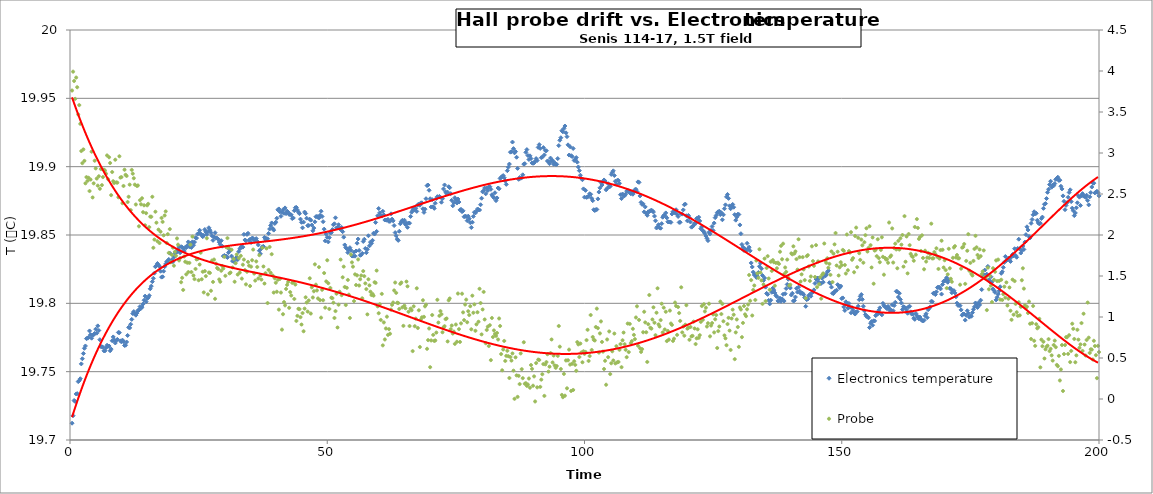
| Category | Electronics temperature |
|---|---|
| 0.4 | 19.712 |
| 0.6000000000000001 | 19.718 |
| 0.8 | 19.729 |
| 1.0 | 19.728 |
| 1.2 | 19.734 |
| 1.4 | 19.734 |
| 1.5999999999999999 | 19.743 |
| 1.7999999999999998 | 19.743 |
| 1.9999999999999998 | 19.745 |
| 2.1999999999999997 | 19.756 |
| 2.4 | 19.759 |
| 2.6 | 19.763 |
| 2.8000000000000003 | 19.767 |
| 3.0000000000000004 | 19.769 |
| 3.2000000000000006 | 19.774 |
| 3.400000000000001 | 19.774 |
| 3.600000000000001 | 19.775 |
| 3.800000000000001 | 19.78 |
| 4.000000000000001 | 19.777 |
| 4.200000000000001 | 19.774 |
| 4.400000000000001 | 19.777 |
| 4.600000000000001 | 19.777 |
| 4.800000000000002 | 19.778 |
| 5.000000000000002 | 19.781 |
| 5.200000000000002 | 19.778 |
| 5.400000000000002 | 19.784 |
| 5.600000000000002 | 19.78 |
| 5.8000000000000025 | 19.773 |
| 6.000000000000003 | 19.768 |
| 6.200000000000003 | 19.768 |
| 6.400000000000003 | 19.768 |
| 6.600000000000003 | 19.765 |
| 6.800000000000003 | 19.765 |
| 7.0000000000000036 | 19.767 |
| 7.200000000000004 | 19.769 |
| 7.400000000000004 | 19.769 |
| 7.600000000000004 | 19.769 |
| 7.800000000000004 | 19.765 |
| 8.000000000000004 | 19.767 |
| 8.200000000000003 | 19.773 |
| 8.400000000000002 | 19.775 |
| 8.600000000000001 | 19.773 |
| 8.8 | 19.771 |
| 9.0 | 19.773 |
| 9.2 | 19.774 |
| 9.399999999999999 | 19.779 |
| 9.599999999999998 | 19.779 |
| 9.799999999999997 | 19.773 |
| 9.999999999999996 | 19.772 |
| 10.199999999999996 | 19.773 |
| 10.399999999999995 | 19.772 |
| 10.599999999999994 | 19.769 |
| 10.799999999999994 | 19.769 |
| 10.999999999999993 | 19.772 |
| 11.199999999999992 | 19.776 |
| 11.399999999999991 | 19.782 |
| 11.59999999999999 | 19.782 |
| 11.79999999999999 | 19.785 |
| 11.99999999999999 | 19.788 |
| 12.199999999999989 | 19.793 |
| 12.399999999999988 | 19.794 |
| 12.599999999999987 | 19.792 |
| 12.799999999999986 | 19.791 |
| 12.999999999999986 | 19.793 |
| 13.199999999999985 | 19.795 |
| 13.399999999999984 | 19.795 |
| 13.599999999999984 | 19.798 |
| 13.799999999999983 | 19.796 |
| 13.999999999999982 | 19.797 |
| 14.199999999999982 | 19.799 |
| 14.39999999999998 | 19.802 |
| 14.59999999999998 | 19.805 |
| 14.79999999999998 | 19.801 |
| 14.999999999999979 | 19.804 |
| 15.199999999999978 | 19.804 |
| 15.399999999999977 | 19.806 |
| 15.599999999999977 | 19.811 |
| 15.799999999999976 | 19.813 |
| 15.999999999999975 | 19.816 |
| 16.199999999999974 | 19.818 |
| 16.399999999999974 | 19.822 |
| 16.599999999999973 | 19.827 |
| 16.799999999999972 | 19.828 |
| 16.99999999999997 | 19.829 |
| 17.19999999999997 | 19.828 |
| 17.39999999999997 | 19.827 |
| 17.59999999999997 | 19.823 |
| 17.79999999999997 | 19.819 |
| 17.999999999999968 | 19.819 |
| 18.199999999999967 | 19.824 |
| 18.399999999999967 | 19.827 |
| 18.599999999999966 | 19.829 |
| 18.799999999999965 | 19.83 |
| 18.999999999999964 | 19.831 |
| 19.199999999999964 | 19.832 |
| 19.399999999999963 | 19.837 |
| 19.599999999999962 | 19.831 |
| 19.79999999999996 | 19.832 |
| 19.99999999999996 | 19.83 |
| 20.19999999999996 | 19.834 |
| 20.39999999999996 | 19.837 |
| 20.59999999999996 | 19.838 |
| 20.799999999999958 | 19.838 |
| 20.999999999999957 | 19.839 |
| 21.199999999999957 | 19.841 |
| 21.399999999999956 | 19.837 |
| 21.599999999999955 | 19.841 |
| 21.799999999999955 | 19.841 |
| 21.999999999999954 | 19.84 |
| 22.199999999999953 | 19.838 |
| 22.399999999999952 | 19.841 |
| 22.59999999999995 | 19.841 |
| 22.79999999999995 | 19.842 |
| 22.99999999999995 | 19.845 |
| 23.19999999999995 | 19.841 |
| 23.39999999999995 | 19.844 |
| 23.599999999999948 | 19.841 |
| 23.799999999999947 | 19.845 |
| 23.999999999999947 | 19.843 |
| 24.199999999999946 | 19.845 |
| 24.399999999999945 | 19.848 |
| 24.599999999999945 | 19.848 |
| 24.799999999999944 | 19.851 |
| 24.999999999999943 | 19.851 |
| 25.199999999999942 | 19.853 |
| 25.39999999999994 | 19.851 |
| 25.59999999999994 | 19.85 |
| 25.79999999999994 | 19.849 |
| 25.99999999999994 | 19.85 |
| 26.19999999999994 | 19.854 |
| 26.399999999999938 | 19.852 |
| 26.599999999999937 | 19.85 |
| 26.799999999999937 | 19.852 |
| 26.999999999999936 | 19.855 |
| 27.199999999999935 | 19.854 |
| 27.399999999999935 | 19.852 |
| 27.599999999999934 | 19.849 |
| 27.799999999999933 | 19.846 |
| 27.999999999999932 | 19.849 |
| 28.199999999999932 | 19.852 |
| 28.39999999999993 | 19.848 |
| 28.59999999999993 | 19.848 |
| 28.79999999999993 | 19.847 |
| 28.99999999999993 | 19.845 |
| 29.19999999999993 | 19.843 |
| 29.399999999999928 | 19.846 |
| 29.599999999999927 | 19.842 |
| 29.799999999999926 | 19.835 |
| 29.999999999999925 | 19.835 |
| 30.199999999999925 | 19.835 |
| 30.399999999999924 | 19.835 |
| 30.599999999999923 | 19.834 |
| 30.799999999999923 | 19.837 |
| 30.999999999999922 | 19.839 |
| 31.19999999999992 | 19.839 |
| 31.39999999999992 | 19.835 |
| 31.59999999999992 | 19.831 |
| 31.79999999999992 | 19.833 |
| 31.99999999999992 | 19.83 |
| 32.19999999999992 | 19.832 |
| 32.39999999999992 | 19.834 |
| 32.59999999999992 | 19.832 |
| 32.799999999999926 | 19.838 |
| 32.99999999999993 | 19.84 |
| 33.19999999999993 | 19.841 |
| 33.399999999999935 | 19.841 |
| 33.59999999999994 | 19.841 |
| 33.79999999999994 | 19.85 |
| 33.99999999999994 | 19.846 |
| 34.199999999999946 | 19.846 |
| 34.39999999999995 | 19.85 |
| 34.59999999999995 | 19.851 |
| 34.799999999999955 | 19.846 |
| 34.99999999999996 | 19.847 |
| 35.19999999999996 | 19.844 |
| 35.39999999999996 | 19.848 |
| 35.599999999999966 | 19.847 |
| 35.79999999999997 | 19.846 |
| 35.99999999999997 | 19.847 |
| 36.199999999999974 | 19.847 |
| 36.39999999999998 | 19.845 |
| 36.59999999999998 | 19.843 |
| 36.79999999999998 | 19.838 |
| 36.999999999999986 | 19.836 |
| 37.19999999999999 | 19.84 |
| 37.39999999999999 | 19.841 |
| 37.599999999999994 | 19.842 |
| 37.8 | 19.848 |
| 38.0 | 19.846 |
| 38.2 | 19.847 |
| 38.400000000000006 | 19.847 |
| 38.60000000000001 | 19.851 |
| 38.80000000000001 | 19.854 |
| 39.000000000000014 | 19.857 |
| 39.20000000000002 | 19.859 |
| 39.40000000000002 | 19.855 |
| 39.60000000000002 | 19.854 |
| 39.800000000000026 | 19.858 |
| 40.00000000000003 | 19.859 |
| 40.20000000000003 | 19.862 |
| 40.400000000000034 | 19.868 |
| 40.60000000000004 | 19.869 |
| 40.80000000000004 | 19.867 |
| 41.00000000000004 | 19.864 |
| 41.200000000000045 | 19.867 |
| 41.40000000000005 | 19.868 |
| 41.60000000000005 | 19.866 |
| 41.800000000000054 | 19.87 |
| 42.00000000000006 | 19.866 |
| 42.20000000000006 | 19.867 |
| 42.40000000000006 | 19.867 |
| 42.600000000000065 | 19.865 |
| 42.80000000000007 | 19.865 |
| 43.00000000000007 | 19.865 |
| 43.200000000000074 | 19.862 |
| 43.40000000000008 | 19.862 |
| 43.60000000000008 | 19.868 |
| 43.80000000000008 | 19.87 |
| 44.000000000000085 | 19.87 |
| 44.20000000000009 | 19.868 |
| 44.40000000000009 | 19.867 |
| 44.600000000000094 | 19.866 |
| 44.8000000000001 | 19.862 |
| 45.0000000000001 | 19.859 |
| 45.2000000000001 | 19.855 |
| 45.400000000000105 | 19.859 |
| 45.60000000000011 | 19.867 |
| 45.80000000000011 | 19.866 |
| 46.000000000000114 | 19.862 |
| 46.20000000000012 | 19.857 |
| 46.40000000000012 | 19.857 |
| 46.60000000000012 | 19.862 |
| 46.800000000000125 | 19.861 |
| 47.00000000000013 | 19.857 |
| 47.20000000000013 | 19.853 |
| 47.400000000000134 | 19.855 |
| 47.600000000000136 | 19.86 |
| 47.80000000000014 | 19.863 |
| 48.00000000000014 | 19.864 |
| 48.200000000000145 | 19.863 |
| 48.40000000000015 | 19.863 |
| 48.60000000000015 | 19.864 |
| 48.80000000000015 | 19.867 |
| 49.000000000000156 | 19.864 |
| 49.20000000000016 | 19.86 |
| 49.40000000000016 | 19.854 |
| 49.600000000000165 | 19.846 |
| 49.80000000000017 | 19.851 |
| 50.00000000000017 | 19.848 |
| 50.20000000000017 | 19.845 |
| 50.400000000000176 | 19.848 |
| 50.60000000000018 | 19.852 |
| 50.80000000000018 | 19.852 |
| 51.000000000000185 | 19.854 |
| 51.20000000000019 | 19.857 |
| 51.40000000000019 | 19.858 |
| 51.60000000000019 | 19.863 |
| 51.800000000000196 | 19.855 |
| 52.0000000000002 | 19.855 |
| 52.2000000000002 | 19.858 |
| 52.400000000000205 | 19.855 |
| 52.60000000000021 | 19.854 |
| 52.80000000000021 | 19.856 |
| 53.00000000000021 | 19.852 |
| 53.200000000000216 | 19.848 |
| 53.40000000000022 | 19.843 |
| 53.60000000000022 | 19.841 |
| 53.800000000000225 | 19.84 |
| 54.00000000000023 | 19.837 |
| 54.20000000000023 | 19.839 |
| 54.40000000000023 | 19.841 |
| 54.600000000000236 | 19.839 |
| 54.80000000000024 | 19.835 |
| 55.00000000000024 | 19.835 |
| 55.200000000000244 | 19.837 |
| 55.40000000000025 | 19.835 |
| 55.60000000000025 | 19.838 |
| 55.80000000000025 | 19.844 |
| 56.000000000000256 | 19.847 |
| 56.20000000000026 | 19.839 |
| 56.40000000000026 | 19.835 |
| 56.600000000000264 | 19.835 |
| 56.80000000000027 | 19.837 |
| 57.00000000000027 | 19.845 |
| 57.20000000000027 | 19.847 |
| 57.400000000000276 | 19.84 |
| 57.60000000000028 | 19.837 |
| 57.80000000000028 | 19.84 |
| 58.000000000000284 | 19.849 |
| 58.20000000000029 | 19.842 |
| 58.40000000000029 | 19.845 |
| 58.60000000000029 | 19.844 |
| 58.800000000000296 | 19.846 |
| 59.0000000000003 | 19.851 |
| 59.2000000000003 | 19.851 |
| 59.400000000000304 | 19.859 |
| 59.60000000000031 | 19.853 |
| 59.80000000000031 | 19.864 |
| 60.00000000000031 | 19.869 |
| 60.200000000000315 | 19.866 |
| 60.40000000000032 | 19.864 |
| 60.60000000000032 | 19.864 |
| 60.800000000000324 | 19.867 |
| 61.00000000000033 | 19.865 |
| 61.20000000000033 | 19.861 |
| 61.40000000000033 | 19.861 |
| 61.600000000000335 | 19.861 |
| 61.80000000000034 | 19.861 |
| 62.00000000000034 | 19.86 |
| 62.200000000000344 | 19.86 |
| 62.40000000000035 | 19.865 |
| 62.60000000000035 | 19.862 |
| 62.80000000000035 | 19.86 |
| 63.000000000000355 | 19.857 |
| 63.20000000000036 | 19.852 |
| 63.40000000000036 | 19.849 |
| 63.600000000000364 | 19.847 |
| 63.80000000000037 | 19.846 |
| 64.00000000000037 | 19.853 |
| 64.20000000000037 | 19.858 |
| 64.40000000000038 | 19.86 |
| 64.60000000000038 | 19.861 |
| 64.80000000000038 | 19.86 |
| 65.00000000000038 | 19.861 |
| 65.20000000000039 | 19.858 |
| 65.40000000000039 | 19.859 |
| 65.60000000000039 | 19.856 |
| 65.8000000000004 | 19.859 |
| 66.0000000000004 | 19.859 |
| 66.2000000000004 | 19.864 |
| 66.4000000000004 | 19.867 |
| 66.6000000000004 | 19.868 |
| 66.80000000000041 | 19.869 |
| 67.00000000000041 | 19.868 |
| 67.20000000000041 | 19.87 |
| 67.40000000000042 | 19.867 |
| 67.60000000000042 | 19.872 |
| 67.80000000000042 | 19.872 |
| 68.00000000000043 | 19.872 |
| 68.20000000000043 | 19.873 |
| 68.40000000000043 | 19.874 |
| 68.60000000000043 | 19.869 |
| 68.80000000000044 | 19.867 |
| 69.00000000000044 | 19.869 |
| 69.20000000000044 | 19.877 |
| 69.40000000000045 | 19.886 |
| 69.60000000000045 | 19.887 |
| 69.80000000000045 | 19.883 |
| 70.00000000000045 | 19.877 |
| 70.20000000000046 | 19.871 |
| 70.40000000000046 | 19.876 |
| 70.60000000000046 | 19.871 |
| 70.80000000000047 | 19.869 |
| 71.00000000000047 | 19.873 |
| 71.20000000000047 | 19.877 |
| 71.40000000000047 | 19.878 |
| 71.60000000000048 | 19.878 |
| 71.80000000000048 | 19.878 |
| 72.00000000000048 | 19.878 |
| 72.20000000000049 | 19.874 |
| 72.40000000000049 | 19.877 |
| 72.60000000000049 | 19.884 |
| 72.8000000000005 | 19.887 |
| 73.0000000000005 | 19.882 |
| 73.2000000000005 | 19.88 |
| 73.4000000000005 | 19.881 |
| 73.6000000000005 | 19.885 |
| 73.80000000000051 | 19.885 |
| 74.00000000000051 | 19.88 |
| 74.20000000000051 | 19.875 |
| 74.40000000000052 | 19.871 |
| 74.60000000000052 | 19.874 |
| 74.80000000000052 | 19.877 |
| 75.00000000000053 | 19.876 |
| 75.20000000000053 | 19.873 |
| 75.40000000000053 | 19.876 |
| 75.60000000000053 | 19.874 |
| 75.80000000000054 | 19.868 |
| 76.00000000000054 | 19.869 |
| 76.20000000000054 | 19.867 |
| 76.40000000000055 | 19.868 |
| 76.60000000000055 | 19.863 |
| 76.80000000000055 | 19.864 |
| 77.00000000000055 | 19.863 |
| 77.20000000000056 | 19.86 |
| 77.40000000000056 | 19.864 |
| 77.60000000000056 | 19.862 |
| 77.80000000000057 | 19.859 |
| 78.00000000000057 | 19.855 |
| 78.20000000000057 | 19.859 |
| 78.40000000000057 | 19.864 |
| 78.60000000000058 | 19.867 |
| 78.80000000000058 | 19.866 |
| 79.00000000000058 | 19.867 |
| 79.20000000000059 | 19.869 |
| 79.40000000000059 | 19.869 |
| 79.60000000000059 | 19.868 |
| 79.8000000000006 | 19.872 |
| 80.0000000000006 | 19.877 |
| 80.2000000000006 | 19.882 |
| 80.4000000000006 | 19.882 |
| 80.6000000000006 | 19.884 |
| 80.80000000000061 | 19.88 |
| 81.00000000000061 | 19.884 |
| 81.20000000000061 | 19.882 |
| 81.40000000000062 | 19.885 |
| 81.60000000000062 | 19.885 |
| 81.80000000000062 | 19.883 |
| 82.00000000000063 | 19.879 |
| 82.20000000000063 | 19.878 |
| 82.40000000000063 | 19.877 |
| 82.60000000000063 | 19.881 |
| 82.80000000000064 | 19.875 |
| 83.00000000000064 | 19.877 |
| 83.20000000000064 | 19.884 |
| 83.40000000000065 | 19.884 |
| 83.60000000000065 | 19.891 |
| 83.80000000000065 | 19.892 |
| 84.00000000000065 | 19.893 |
| 84.20000000000066 | 19.893 |
| 84.40000000000066 | 19.892 |
| 84.60000000000066 | 19.89 |
| 84.80000000000067 | 19.887 |
| 85.00000000000067 | 19.897 |
| 85.20000000000067 | 19.9 |
| 85.40000000000067 | 19.902 |
| 85.60000000000068 | 19.911 |
| 85.80000000000068 | 19.911 |
| 86.00000000000068 | 19.918 |
| 86.20000000000068 | 19.913 |
| 86.40000000000069 | 19.91 |
| 86.60000000000069 | 19.911 |
| 86.8000000000007 | 19.907 |
| 87.0000000000007 | 19.899 |
| 87.2000000000007 | 19.891 |
| 87.4000000000007 | 19.892 |
| 87.6000000000007 | 19.891 |
| 87.80000000000071 | 19.892 |
| 88.00000000000071 | 19.894 |
| 88.20000000000071 | 19.902 |
| 88.40000000000072 | 19.902 |
| 88.60000000000072 | 19.91 |
| 88.80000000000072 | 19.912 |
| 89.00000000000072 | 19.908 |
| 89.20000000000073 | 19.905 |
| 89.40000000000073 | 19.908 |
| 89.60000000000073 | 19.906 |
| 89.80000000000074 | 19.903 |
| 90.00000000000074 | 19.902 |
| 90.20000000000074 | 19.903 |
| 90.40000000000074 | 19.904 |
| 90.60000000000075 | 19.906 |
| 90.80000000000075 | 19.905 |
| 91.00000000000075 | 19.914 |
| 91.20000000000076 | 19.916 |
| 91.40000000000076 | 19.913 |
| 91.60000000000076 | 19.907 |
| 91.80000000000076 | 19.907 |
| 92.00000000000077 | 19.914 |
| 92.20000000000077 | 19.909 |
| 92.40000000000077 | 19.912 |
| 92.60000000000078 | 19.912 |
| 92.80000000000078 | 19.904 |
| 93.00000000000078 | 19.904 |
| 93.20000000000078 | 19.902 |
| 93.40000000000079 | 19.906 |
| 93.60000000000079 | 19.904 |
| 93.8000000000008 | 19.905 |
| 94.0000000000008 | 19.902 |
| 94.2000000000008 | 19.903 |
| 94.4000000000008 | 19.902 |
| 94.6000000000008 | 19.902 |
| 94.80000000000081 | 19.906 |
| 95.00000000000081 | 19.915 |
| 95.20000000000081 | 19.919 |
| 95.40000000000082 | 19.921 |
| 95.60000000000082 | 19.926 |
| 95.80000000000082 | 19.926 |
| 96.00000000000082 | 19.928 |
| 96.20000000000083 | 19.93 |
| 96.40000000000083 | 19.925 |
| 96.60000000000083 | 19.922 |
| 96.80000000000084 | 19.916 |
| 97.00000000000084 | 19.908 |
| 97.20000000000084 | 19.915 |
| 97.40000000000084 | 19.908 |
| 97.60000000000085 | 19.907 |
| 97.80000000000085 | 19.913 |
| 98.00000000000085 | 19.905 |
| 98.20000000000086 | 19.905 |
| 98.40000000000086 | 19.907 |
| 98.60000000000086 | 19.903 |
| 98.80000000000086 | 19.9 |
| 99.00000000000087 | 19.897 |
| 99.20000000000087 | 19.894 |
| 99.40000000000087 | 19.891 |
| 99.60000000000088 | 19.89 |
| 99.80000000000088 | 19.884 |
| 100.00000000000088 | 19.878 |
| 100.20000000000088 | 19.883 |
| 100.40000000000089 | 19.878 |
| 100.60000000000089 | 19.878 |
| 100.80000000000089 | 19.879 |
| 101.0000000000009 | 19.88 |
| 101.2000000000009 | 19.88 |
| 101.4000000000009 | 19.877 |
| 101.6000000000009 | 19.875 |
| 101.8000000000009 | 19.868 |
| 102.00000000000091 | 19.868 |
| 102.20000000000091 | 19.869 |
| 102.40000000000092 | 19.869 |
| 102.60000000000092 | 19.876 |
| 102.80000000000092 | 19.881 |
| 103.00000000000092 | 19.885 |
| 103.20000000000093 | 19.888 |
| 103.40000000000093 | 19.887 |
| 103.60000000000093 | 19.889 |
| 103.80000000000094 | 19.89 |
| 104.00000000000094 | 19.889 |
| 104.20000000000094 | 19.883 |
| 104.40000000000094 | 19.884 |
| 104.60000000000095 | 19.888 |
| 104.80000000000095 | 19.885 |
| 105.00000000000095 | 19.886 |
| 105.20000000000095 | 19.894 |
| 105.40000000000096 | 19.896 |
| 105.60000000000096 | 19.897 |
| 105.80000000000096 | 19.894 |
| 106.00000000000097 | 19.889 |
| 106.20000000000097 | 19.887 |
| 106.40000000000097 | 19.89 |
| 106.60000000000097 | 19.89 |
| 106.80000000000098 | 19.888 |
| 107.00000000000098 | 19.879 |
| 107.20000000000098 | 19.877 |
| 107.40000000000099 | 19.88 |
| 107.60000000000099 | 19.879 |
| 107.80000000000099 | 19.879 |
| 108.000000000001 | 19.88 |
| 108.200000000001 | 19.882 |
| 108.400000000001 | 19.883 |
| 108.600000000001 | 19.882 |
| 108.800000000001 | 19.881 |
| 109.00000000000101 | 19.88 |
| 109.20000000000101 | 19.881 |
| 109.40000000000101 | 19.88 |
| 109.60000000000102 | 19.881 |
| 109.80000000000102 | 19.883 |
| 110.00000000000102 | 19.883 |
| 110.20000000000103 | 19.882 |
| 110.40000000000103 | 19.889 |
| 110.60000000000103 | 19.889 |
| 110.80000000000103 | 19.879 |
| 111.00000000000104 | 19.874 |
| 111.20000000000104 | 19.872 |
| 111.40000000000104 | 19.873 |
| 111.60000000000105 | 19.867 |
| 111.80000000000105 | 19.871 |
| 112.00000000000105 | 19.866 |
| 112.20000000000105 | 19.864 |
| 112.40000000000106 | 19.867 |
| 112.60000000000106 | 19.867 |
| 112.80000000000106 | 19.868 |
| 113.00000000000107 | 19.868 |
| 113.20000000000107 | 19.868 |
| 113.40000000000107 | 19.867 |
| 113.60000000000107 | 19.864 |
| 113.80000000000108 | 19.86 |
| 114.00000000000108 | 19.855 |
| 114.20000000000108 | 19.856 |
| 114.40000000000109 | 19.858 |
| 114.60000000000109 | 19.855 |
| 114.80000000000109 | 19.855 |
| 115.0000000000011 | 19.858 |
| 115.2000000000011 | 19.863 |
| 115.4000000000011 | 19.864 |
| 115.6000000000011 | 19.864 |
| 115.8000000000011 | 19.866 |
| 116.00000000000111 | 19.863 |
| 116.20000000000111 | 19.86 |
| 116.40000000000111 | 19.86 |
| 116.60000000000112 | 19.859 |
| 116.80000000000112 | 19.859 |
| 117.00000000000112 | 19.865 |
| 117.20000000000113 | 19.867 |
| 117.40000000000113 | 19.867 |
| 117.60000000000113 | 19.866 |
| 117.80000000000113 | 19.868 |
| 118.00000000000114 | 19.865 |
| 118.20000000000114 | 19.864 |
| 118.40000000000114 | 19.859 |
| 118.60000000000115 | 19.859 |
| 118.80000000000115 | 19.865 |
| 119.00000000000115 | 19.865 |
| 119.20000000000115 | 19.868 |
| 119.40000000000116 | 19.872 |
| 119.60000000000116 | 19.873 |
| 119.80000000000116 | 19.864 |
| 120.00000000000117 | 19.86 |
| 120.20000000000117 | 19.864 |
| 120.40000000000117 | 19.863 |
| 120.60000000000117 | 19.86 |
| 120.80000000000118 | 19.856 |
| 121.00000000000118 | 19.856 |
| 121.20000000000118 | 19.857 |
| 121.40000000000119 | 19.859 |
| 121.60000000000119 | 19.859 |
| 121.80000000000119 | 19.862 |
| 122.0000000000012 | 19.862 |
| 122.2000000000012 | 19.863 |
| 122.4000000000012 | 19.86 |
| 122.6000000000012 | 19.855 |
| 122.8000000000012 | 19.856 |
| 123.00000000000121 | 19.853 |
| 123.20000000000121 | 19.852 |
| 123.40000000000121 | 19.851 |
| 123.60000000000122 | 19.849 |
| 123.80000000000122 | 19.848 |
| 124.00000000000122 | 19.846 |
| 124.20000000000122 | 19.852 |
| 124.40000000000123 | 19.851 |
| 124.60000000000123 | 19.853 |
| 124.80000000000123 | 19.856 |
| 125.00000000000124 | 19.853 |
| 125.20000000000124 | 19.859 |
| 125.40000000000124 | 19.863 |
| 125.60000000000124 | 19.864 |
| 125.80000000000125 | 19.866 |
| 126.00000000000125 | 19.867 |
| 126.20000000000125 | 19.867 |
| 126.40000000000126 | 19.865 |
| 126.60000000000126 | 19.866 |
| 126.80000000000126 | 19.861 |
| 127.00000000000126 | 19.865 |
| 127.20000000000127 | 19.869 |
| 127.40000000000127 | 19.872 |
| 127.60000000000127 | 19.878 |
| 127.80000000000128 | 19.88 |
| 128.00000000000128 | 19.877 |
| 128.20000000000127 | 19.871 |
| 128.40000000000126 | 19.869 |
| 128.60000000000124 | 19.871 |
| 128.80000000000123 | 19.872 |
| 129.00000000000122 | 19.87 |
| 129.2000000000012 | 19.865 |
| 129.4000000000012 | 19.861 |
| 129.6000000000012 | 19.863 |
| 129.80000000000118 | 19.865 |
| 130.00000000000117 | 19.865 |
| 130.20000000000115 | 19.857 |
| 130.40000000000114 | 19.851 |
| 130.60000000000113 | 19.843 |
| 130.80000000000112 | 19.841 |
| 131.0000000000011 | 19.839 |
| 131.2000000000011 | 19.84 |
| 131.40000000000109 | 19.838 |
| 131.60000000000107 | 19.844 |
| 131.80000000000106 | 19.84 |
| 132.00000000000105 | 19.841 |
| 132.20000000000104 | 19.838 |
| 132.40000000000103 | 19.83 |
| 132.60000000000102 | 19.827 |
| 132.800000000001 | 19.823 |
| 133.000000000001 | 19.821 |
| 133.20000000000098 | 19.821 |
| 133.40000000000097 | 19.819 |
| 133.60000000000096 | 19.82 |
| 133.80000000000095 | 19.823 |
| 134.00000000000094 | 19.827 |
| 134.20000000000093 | 19.829 |
| 134.40000000000092 | 19.825 |
| 134.6000000000009 | 19.82 |
| 134.8000000000009 | 19.817 |
| 135.00000000000088 | 19.819 |
| 135.20000000000087 | 19.812 |
| 135.40000000000086 | 19.807 |
| 135.60000000000085 | 19.807 |
| 135.80000000000084 | 19.802 |
| 136.00000000000082 | 19.8 |
| 136.2000000000008 | 19.802 |
| 136.4000000000008 | 19.808 |
| 136.6000000000008 | 19.811 |
| 136.80000000000078 | 19.81 |
| 137.00000000000077 | 19.808 |
| 137.20000000000076 | 19.806 |
| 137.40000000000074 | 19.805 |
| 137.60000000000073 | 19.802 |
| 137.80000000000072 | 19.802 |
| 138.0000000000007 | 19.804 |
| 138.2000000000007 | 19.801 |
| 138.4000000000007 | 19.803 |
| 138.60000000000068 | 19.807 |
| 138.80000000000067 | 19.802 |
| 139.00000000000065 | 19.807 |
| 139.20000000000064 | 19.811 |
| 139.40000000000063 | 19.814 |
| 139.60000000000062 | 19.818 |
| 139.8000000000006 | 19.813 |
| 140.0000000000006 | 19.811 |
| 140.20000000000059 | 19.806 |
| 140.40000000000057 | 19.807 |
| 140.60000000000056 | 19.802 |
| 140.80000000000055 | 19.802 |
| 141.00000000000054 | 19.805 |
| 141.20000000000053 | 19.811 |
| 141.40000000000052 | 19.808 |
| 141.6000000000005 | 19.812 |
| 141.8000000000005 | 19.809 |
| 142.00000000000048 | 19.807 |
| 142.20000000000047 | 19.807 |
| 142.40000000000046 | 19.807 |
| 142.60000000000045 | 19.806 |
| 142.80000000000044 | 19.804 |
| 143.00000000000043 | 19.798 |
| 143.20000000000041 | 19.803 |
| 143.4000000000004 | 19.803 |
| 143.6000000000004 | 19.806 |
| 143.80000000000038 | 19.806 |
| 144.00000000000037 | 19.805 |
| 144.20000000000036 | 19.808 |
| 144.40000000000035 | 19.808 |
| 144.60000000000034 | 19.81 |
| 144.80000000000032 | 19.815 |
| 145.0000000000003 | 19.818 |
| 145.2000000000003 | 19.819 |
| 145.4000000000003 | 19.816 |
| 145.60000000000028 | 19.819 |
| 145.80000000000027 | 19.815 |
| 146.00000000000026 | 19.815 |
| 146.20000000000024 | 19.818 |
| 146.40000000000023 | 19.815 |
| 146.60000000000022 | 19.821 |
| 146.8000000000002 | 19.82 |
| 147.0000000000002 | 19.821 |
| 147.2000000000002 | 19.823 |
| 147.40000000000018 | 19.824 |
| 147.60000000000016 | 19.815 |
| 147.80000000000015 | 19.815 |
| 148.00000000000014 | 19.812 |
| 148.20000000000013 | 19.807 |
| 148.40000000000012 | 19.807 |
| 148.6000000000001 | 19.809 |
| 148.8000000000001 | 19.809 |
| 149.00000000000009 | 19.81 |
| 149.20000000000007 | 19.814 |
| 149.40000000000006 | 19.813 |
| 149.60000000000005 | 19.812 |
| 149.80000000000004 | 19.813 |
| 150.00000000000003 | 19.804 |
| 150.20000000000002 | 19.804 |
| 150.4 | 19.797 |
| 150.6 | 19.795 |
| 150.79999999999998 | 19.801 |
| 150.99999999999997 | 19.8 |
| 151.19999999999996 | 19.797 |
| 151.39999999999995 | 19.8 |
| 151.59999999999994 | 19.797 |
| 151.79999999999993 | 19.793 |
| 151.99999999999991 | 19.797 |
| 152.1999999999999 | 19.795 |
| 152.3999999999999 | 19.793 |
| 152.59999999999988 | 19.792 |
| 152.79999999999987 | 19.794 |
| 152.99999999999986 | 19.794 |
| 153.19999999999985 | 19.798 |
| 153.39999999999984 | 19.803 |
| 153.59999999999982 | 19.805 |
| 153.7999999999998 | 19.806 |
| 153.9999999999998 | 19.803 |
| 154.1999999999998 | 19.798 |
| 154.39999999999978 | 19.795 |
| 154.59999999999977 | 19.792 |
| 154.79999999999976 | 19.79 |
| 154.99999999999974 | 19.79 |
| 155.19999999999973 | 19.789 |
| 155.39999999999972 | 19.782 |
| 155.5999999999997 | 19.785 |
| 155.7999999999997 | 19.787 |
| 155.9999999999997 | 19.784 |
| 156.19999999999968 | 19.787 |
| 156.39999999999966 | 19.787 |
| 156.59999999999965 | 19.791 |
| 156.79999999999964 | 19.792 |
| 156.99999999999963 | 19.792 |
| 157.19999999999962 | 19.795 |
| 157.3999999999996 | 19.797 |
| 157.5999999999996 | 19.792 |
| 157.79999999999959 | 19.792 |
| 157.99999999999957 | 19.8 |
| 158.19999999999956 | 19.798 |
| 158.39999999999955 | 19.798 |
| 158.59999999999954 | 19.797 |
| 158.79999999999953 | 19.796 |
| 158.99999999999952 | 19.798 |
| 159.1999999999995 | 19.796 |
| 159.3999999999995 | 19.795 |
| 159.59999999999948 | 19.795 |
| 159.79999999999947 | 19.799 |
| 159.99999999999946 | 19.795 |
| 160.19999999999945 | 19.798 |
| 160.39999999999944 | 19.801 |
| 160.59999999999943 | 19.809 |
| 160.79999999999941 | 19.809 |
| 160.9999999999994 | 19.805 |
| 161.1999999999994 | 19.807 |
| 161.39999999999938 | 19.803 |
| 161.59999999999937 | 19.8 |
| 161.79999999999936 | 19.796 |
| 161.99999999999935 | 19.798 |
| 162.19999999999933 | 19.797 |
| 162.39999999999932 | 19.797 |
| 162.5999999999993 | 19.795 |
| 162.7999999999993 | 19.793 |
| 162.9999999999993 | 19.797 |
| 163.19999999999928 | 19.798 |
| 163.39999999999927 | 19.794 |
| 163.59999999999926 | 19.792 |
| 163.79999999999924 | 19.792 |
| 163.99999999999923 | 19.789 |
| 164.19999999999922 | 19.788 |
| 164.3999999999992 | 19.793 |
| 164.5999999999992 | 19.791 |
| 164.7999999999992 | 19.79 |
| 164.99999999999918 | 19.789 |
| 165.19999999999916 | 19.79 |
| 165.39999999999915 | 19.788 |
| 165.59999999999914 | 19.787 |
| 165.79999999999913 | 19.787 |
| 165.99999999999912 | 19.788 |
| 166.1999999999991 | 19.791 |
| 166.3999999999991 | 19.792 |
| 166.59999999999908 | 19.79 |
| 166.79999999999907 | 19.795 |
| 166.99999999999906 | 19.797 |
| 167.19999999999905 | 19.797 |
| 167.39999999999904 | 19.801 |
| 167.59999999999903 | 19.801 |
| 167.79999999999902 | 19.807 |
| 167.999999999999 | 19.808 |
| 168.199999999999 | 19.806 |
| 168.39999999999898 | 19.808 |
| 168.59999999999897 | 19.812 |
| 168.79999999999896 | 19.812 |
| 168.99999999999895 | 19.812 |
| 169.19999999999894 | 19.811 |
| 169.39999999999893 | 19.807 |
| 169.59999999999891 | 19.814 |
| 169.7999999999989 | 19.816 |
| 169.9999999999989 | 19.816 |
| 170.19999999999888 | 19.817 |
| 170.39999999999887 | 19.819 |
| 170.59999999999886 | 19.815 |
| 170.79999999999885 | 19.817 |
| 170.99999999999883 | 19.811 |
| 171.19999999999882 | 19.811 |
| 171.3999999999988 | 19.808 |
| 171.5999999999988 | 19.809 |
| 171.7999999999988 | 19.809 |
| 171.99999999999878 | 19.808 |
| 172.19999999999877 | 19.805 |
| 172.39999999999876 | 19.8 |
| 172.59999999999874 | 19.798 |
| 172.79999999999873 | 19.799 |
| 172.99999999999872 | 19.798 |
| 173.1999999999987 | 19.795 |
| 173.3999999999987 | 19.791 |
| 173.5999999999987 | 19.792 |
| 173.79999999999868 | 19.792 |
| 173.99999999999866 | 19.788 |
| 174.19999999999865 | 19.791 |
| 174.39999999999864 | 19.795 |
| 174.59999999999863 | 19.793 |
| 174.79999999999862 | 19.79 |
| 174.9999999999986 | 19.791 |
| 175.1999999999986 | 19.791 |
| 175.39999999999858 | 19.793 |
| 175.59999999999857 | 19.796 |
| 175.79999999999856 | 19.797 |
| 175.99999999999855 | 19.8 |
| 176.19999999999854 | 19.799 |
| 176.39999999999853 | 19.797 |
| 176.59999999999852 | 19.8 |
| 176.7999999999985 | 19.799 |
| 176.9999999999985 | 19.802 |
| 177.19999999999848 | 19.81 |
| 177.39999999999847 | 19.819 |
| 177.59999999999846 | 19.821 |
| 177.79999999999845 | 19.824 |
| 177.99999999999844 | 19.82 |
| 178.19999999999843 | 19.821 |
| 178.3999999999984 | 19.827 |
| 178.5999999999984 | 19.817 |
| 178.7999999999984 | 19.816 |
| 178.99999999999838 | 19.819 |
| 179.19999999999837 | 19.816 |
| 179.39999999999836 | 19.81 |
| 179.59999999999835 | 19.809 |
| 179.79999999999833 | 19.808 |
| 179.99999999999832 | 19.803 |
| 180.1999999999983 | 19.804 |
| 180.3999999999983 | 19.807 |
| 180.5999999999983 | 19.809 |
| 180.79999999999828 | 19.812 |
| 180.99999999999827 | 19.822 |
| 181.19999999999825 | 19.823 |
| 181.39999999999824 | 19.826 |
| 181.59999999999823 | 19.83 |
| 181.79999999999822 | 19.834 |
| 181.9999999999982 | 19.831 |
| 182.1999999999982 | 19.832 |
| 182.3999999999982 | 19.833 |
| 182.59999999999818 | 19.832 |
| 182.79999999999816 | 19.831 |
| 182.99999999999815 | 19.834 |
| 183.19999999999814 | 19.836 |
| 183.39999999999813 | 19.835 |
| 183.59999999999812 | 19.84 |
| 183.7999999999981 | 19.835 |
| 183.9999999999981 | 19.834 |
| 184.19999999999808 | 19.84 |
| 184.39999999999807 | 19.847 |
| 184.59999999999806 | 19.84 |
| 184.79999999999805 | 19.837 |
| 184.99999999999804 | 19.839 |
| 185.19999999999803 | 19.842 |
| 185.39999999999802 | 19.839 |
| 185.599999999998 | 19.845 |
| 185.799999999998 | 19.85 |
| 185.99999999999798 | 19.856 |
| 186.19999999999797 | 19.854 |
| 186.39999999999796 | 19.849 |
| 186.59999999999795 | 19.848 |
| 186.79999999999794 | 19.859 |
| 186.99999999999793 | 19.861 |
| 187.1999999999979 | 19.865 |
| 187.3999999999979 | 19.867 |
| 187.5999999999979 | 19.866 |
| 187.79999999999788 | 19.866 |
| 187.99999999999787 | 19.861 |
| 188.19999999999786 | 19.859 |
| 188.39999999999785 | 19.858 |
| 188.59999999999783 | 19.859 |
| 188.79999999999782 | 19.862 |
| 188.9999999999978 | 19.863 |
| 189.1999999999978 | 19.869 |
| 189.3999999999978 | 19.873 |
| 189.59999999999778 | 19.873 |
| 189.79999999999777 | 19.877 |
| 189.99999999999775 | 19.881 |
| 190.19999999999774 | 19.883 |
| 190.39999999999773 | 19.887 |
| 190.59999999999772 | 19.889 |
| 190.7999999999977 | 19.885 |
| 190.9999999999977 | 19.887 |
| 191.1999999999977 | 19.886 |
| 191.39999999999768 | 19.888 |
| 191.59999999999766 | 19.891 |
| 191.79999999999765 | 19.891 |
| 191.99999999999764 | 19.892 |
| 192.19999999999763 | 19.89 |
| 192.39999999999762 | 19.89 |
| 192.5999999999976 | 19.886 |
| 192.7999999999976 | 19.884 |
| 192.99999999999758 | 19.879 |
| 193.19999999999757 | 19.875 |
| 193.39999999999756 | 19.869 |
| 193.59999999999755 | 19.872 |
| 193.79999999999754 | 19.874 |
| 193.99999999999753 | 19.878 |
| 194.19999999999752 | 19.881 |
| 194.3999999999975 | 19.883 |
| 194.5999999999975 | 19.874 |
| 194.79999999999748 | 19.87 |
| 194.99999999999747 | 19.868 |
| 195.19999999999746 | 19.864 |
| 195.39999999999745 | 19.866 |
| 195.59999999999744 | 19.87 |
| 195.79999999999742 | 19.874 |
| 195.9999999999974 | 19.879 |
| 196.1999999999974 | 19.878 |
| 196.3999999999974 | 19.872 |
| 196.59999999999738 | 19.879 |
| 196.79999999999737 | 19.88 |
| 196.99999999999736 | 19.878 |
| 197.19999999999735 | 19.878 |
| 197.39999999999733 | 19.878 |
| 197.59999999999732 | 19.879 |
| 197.7999999999973 | 19.875 |
| 197.9999999999973 | 19.872 |
| 198.1999999999973 | 19.878 |
| 198.39999999999728 | 19.881 |
| 198.59999999999727 | 19.885 |
| 198.79999999999725 | 19.888 |
| 198.99999999999724 | 19.888 |
| 199.19999999999723 | 19.881 |
| 199.39999999999722 | 19.881 |
| 199.5999999999972 | 19.882 |
| 199.7999999999972 | 19.881 |
| 199.9999999999972 | 19.879 |
| 200.19999999999717 | 19.879 |